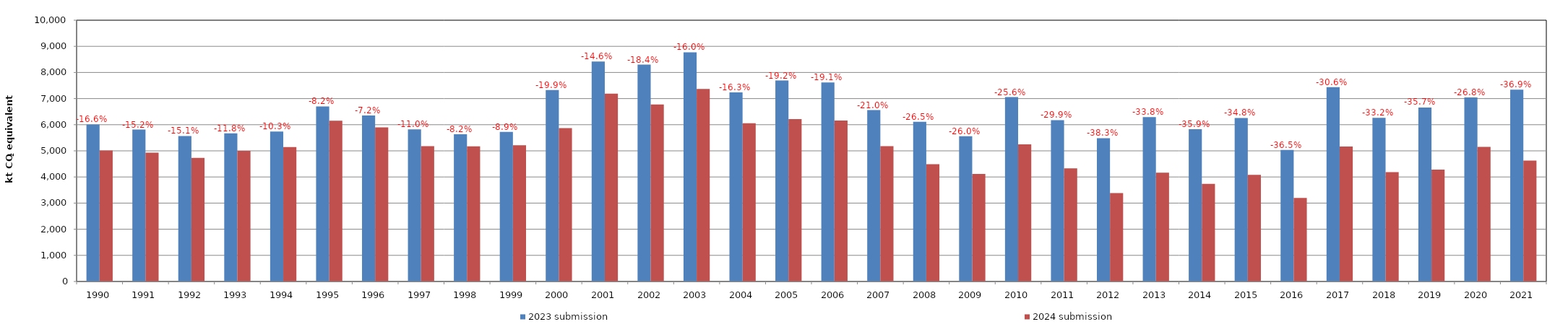
| Category | 2023 submission | 2024 submission |
|---|---|---|
| 1990.0 | 6009.443 | 5010.824 |
| 1991.0 | 5813.889 | 4930.517 |
| 1992.0 | 5568.471 | 4727.643 |
| 1993.0 | 5671.875 | 5001.818 |
| 1994.0 | 5738.749 | 5145.88 |
| 1995.0 | 6702.174 | 6151.439 |
| 1996.0 | 6355.777 | 5897.98 |
| 1997.0 | 5821.925 | 5181.036 |
| 1998.0 | 5632.474 | 5170.162 |
| 1999.0 | 5724.027 | 5216.411 |
| 2000.0 | 7325.639 | 5868.103 |
| 2001.0 | 8417.843 | 7187.89 |
| 2002.0 | 8300.085 | 6772.686 |
| 2003.0 | 8773.857 | 7369.267 |
| 2004.0 | 7238.403 | 6057.696 |
| 2005.0 | 7691.013 | 6212.046 |
| 2006.0 | 7614.877 | 6162.74 |
| 2007.0 | 6559.426 | 5180.278 |
| 2008.0 | 6111.113 | 4489.828 |
| 2009.0 | 5556.757 | 4114.099 |
| 2010.0 | 7055.791 | 5248.211 |
| 2011.0 | 6176.52 | 4327.659 |
| 2012.0 | 5486.629 | 3385.494 |
| 2013.0 | 6289.666 | 4162.07 |
| 2014.0 | 5826.942 | 3737.893 |
| 2015.0 | 6259.409 | 4082.44 |
| 2016.0 | 5036.465 | 3198.315 |
| 2017.0 | 7438.86 | 5165.396 |
| 2018.0 | 6263.984 | 4186.49 |
| 2019.0 | 6657.068 | 4281.983 |
| 2020.0 | 7042.45 | 5152.447 |
| 2021.0 | 7338.251 | 4627.787 |